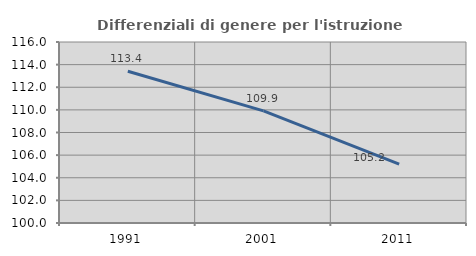
| Category | Differenziali di genere per l'istruzione superiore |
|---|---|
| 1991.0 | 113.413 |
| 2001.0 | 109.914 |
| 2011.0 | 105.196 |